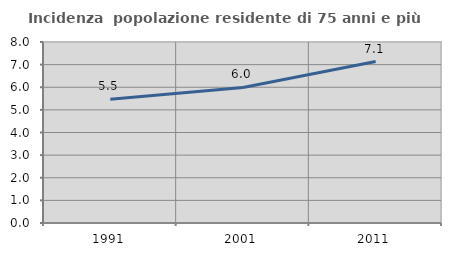
| Category | Incidenza  popolazione residente di 75 anni e più |
|---|---|
| 1991.0 | 5.474 |
| 2001.0 | 5.993 |
| 2011.0 | 7.134 |